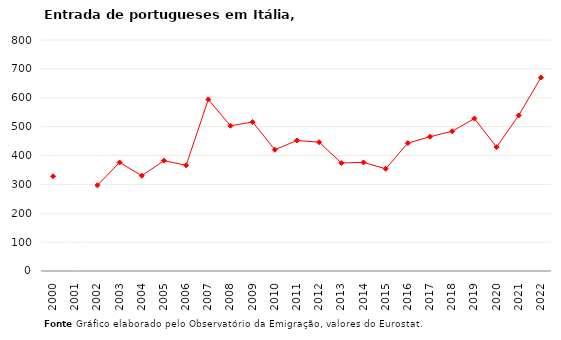
| Category | Entradas |
|---|---|
| 2000.0 | 328 |
| 2001.0 | 0 |
| 2002.0 | 297 |
| 2003.0 | 376 |
| 2004.0 | 330 |
| 2005.0 | 382 |
| 2006.0 | 366 |
| 2007.0 | 594 |
| 2008.0 | 503 |
| 2009.0 | 516 |
| 2010.0 | 420 |
| 2011.0 | 452 |
| 2012.0 | 446 |
| 2013.0 | 374 |
| 2014.0 | 376 |
| 2015.0 | 354 |
| 2016.0 | 443 |
| 2017.0 | 465 |
| 2018.0 | 484 |
| 2019.0 | 528 |
| 2020.0 | 429 |
| 2021.0 | 539 |
| 2022.0 | 670 |